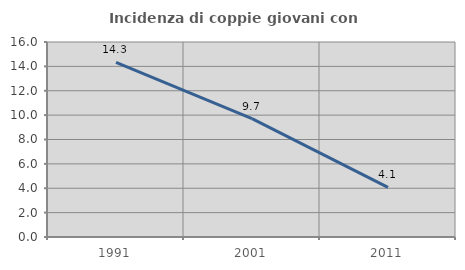
| Category | Incidenza di coppie giovani con figli |
|---|---|
| 1991.0 | 14.329 |
| 2001.0 | 9.709 |
| 2011.0 | 4.075 |